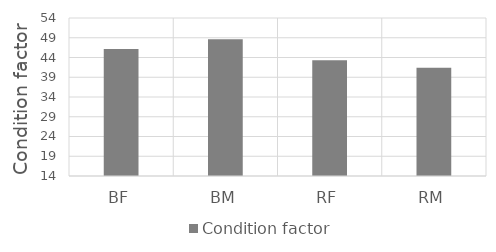
| Category | Condition factor |
|---|---|
| BF | 46.167 |
| BM | 48.641 |
| RF | 43.278 |
| RM | 41.436 |